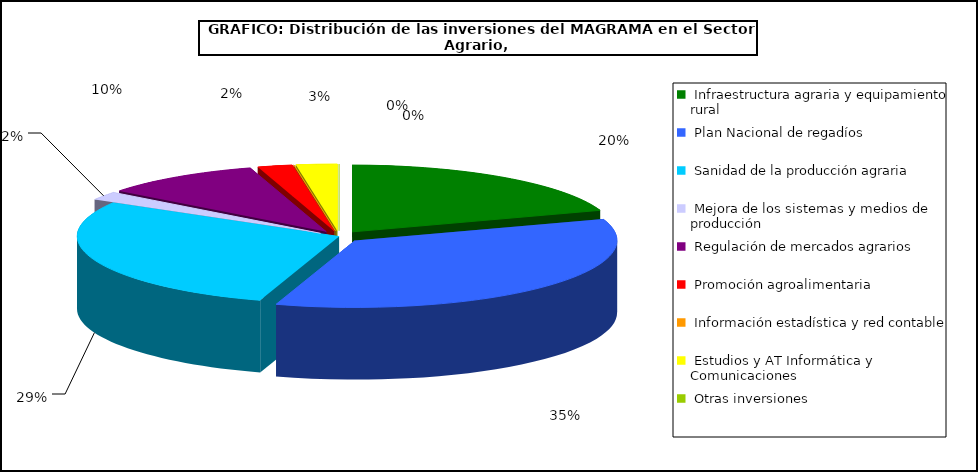
| Category | Series 0 |
|---|---|
|  Infraestructura agraria y equipamiento rural | 14606.59 |
|  Plan Nacional de regadíos | 25935.35 |
|  Sanidad de la producción agraria | 21133.34 |
|  Mejora de los sistemas y medios de producción | 1496.36 |
|  Regulación de mercados agrarios | 7248.54 |
|  Promoción agroalimentaria | 1583.75 |
|  Información estadística y red contable  | 15.81 |
|  Estudios y AT Informática y Comunicaciones | 1871.04 |
|  Otras inversiones | 0 |